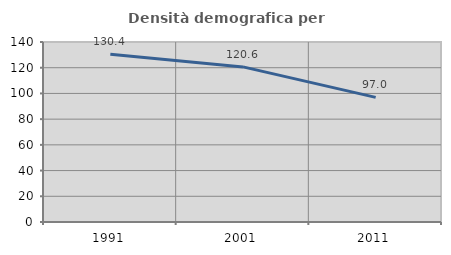
| Category | Densità demografica |
|---|---|
| 1991.0 | 130.416 |
| 2001.0 | 120.634 |
| 2011.0 | 96.95 |